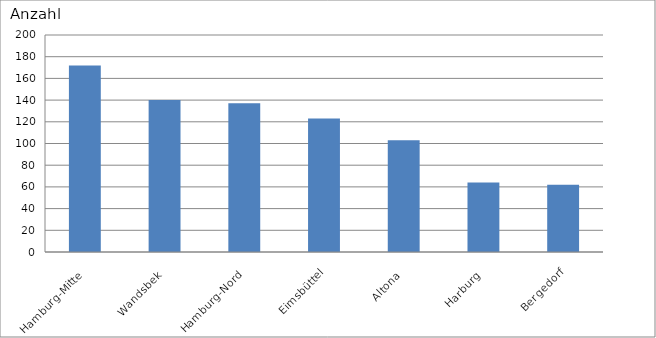
| Category | Hamburg-Mitte |
|---|---|
| Hamburg-Mitte | 172 |
| Wandsbek | 140 |
| Hamburg-Nord | 137 |
| Eimsbüttel | 123 |
| Altona | 103 |
| Harburg | 64 |
| Bergedorf | 62 |